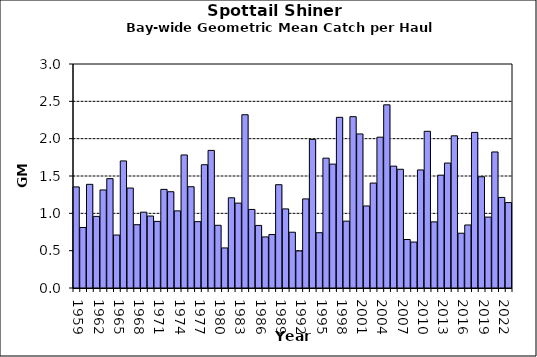
| Category | Series 0 |
|---|---|
| 1959.0 | 1.354 |
| 1960.0 | 0.81 |
| 1961.0 | 1.388 |
| 1962.0 | 0.959 |
| 1963.0 | 1.313 |
| 1964.0 | 1.465 |
| 1965.0 | 0.709 |
| 1966.0 | 1.702 |
| 1967.0 | 1.339 |
| 1968.0 | 0.848 |
| 1969.0 | 1.015 |
| 1970.0 | 0.964 |
| 1971.0 | 0.892 |
| 1972.0 | 1.321 |
| 1973.0 | 1.289 |
| 1974.0 | 1.033 |
| 1975.0 | 1.782 |
| 1976.0 | 1.356 |
| 1977.0 | 0.889 |
| 1978.0 | 1.651 |
| 1979.0 | 1.843 |
| 1980.0 | 0.84 |
| 1981.0 | 0.536 |
| 1982.0 | 1.208 |
| 1983.0 | 1.137 |
| 1984.0 | 2.321 |
| 1985.0 | 1.052 |
| 1986.0 | 0.838 |
| 1987.0 | 0.684 |
| 1988.0 | 0.716 |
| 1989.0 | 1.383 |
| 1990.0 | 1.059 |
| 1991.0 | 0.747 |
| 1992.0 | 0.496 |
| 1993.0 | 1.193 |
| 1994.0 | 1.991 |
| 1995.0 | 0.741 |
| 1996.0 | 1.739 |
| 1997.0 | 1.659 |
| 1998.0 | 2.286 |
| 1999.0 | 0.895 |
| 2000.0 | 2.295 |
| 2001.0 | 2.063 |
| 2002.0 | 1.099 |
| 2003.0 | 1.405 |
| 2004.0 | 2.02 |
| 2005.0 | 2.453 |
| 2006.0 | 1.632 |
| 2007.0 | 1.59 |
| 2008.0 | 0.649 |
| 2009.0 | 0.615 |
| 2010.0 | 1.581 |
| 2011.0 | 2.099 |
| 2012.0 | 0.886 |
| 2013.0 | 1.511 |
| 2014.0 | 1.673 |
| 2015.0 | 2.038 |
| 2016.0 | 0.733 |
| 2017.0 | 0.844 |
| 2018.0 | 2.084 |
| 2019.0 | 1.49 |
| 2020.0 | 0.95 |
| 2021.0 | 1.822 |
| 2022.0 | 1.213 |
| 2023.0 | 1.144 |